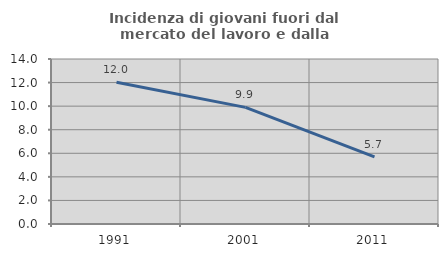
| Category | Incidenza di giovani fuori dal mercato del lavoro e dalla formazione  |
|---|---|
| 1991.0 | 12.027 |
| 2001.0 | 9.898 |
| 2011.0 | 5.703 |